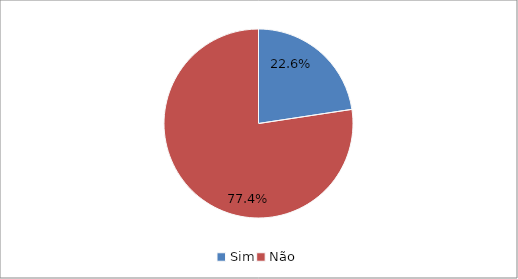
| Category | Series 0 |
|---|---|
| Sim | 0.226 |
| Não | 0.774 |